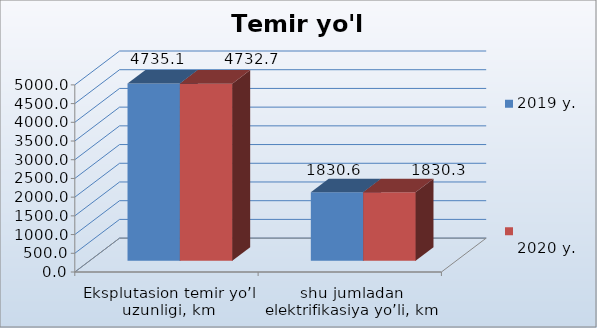
| Category | 2019 y. | 
2020 y. |
|---|---|---|
| Eksplutasion temir yo’l uzunligi, km | 4735.1 | 4732.7 |
| shu jumladan elektrifikasiya yo’li, km | 1830.6 | 1830.3 |